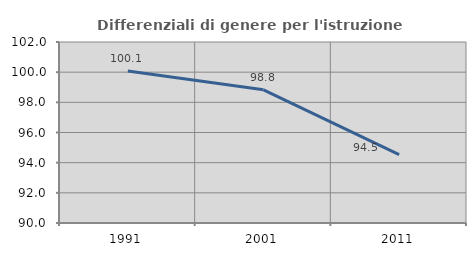
| Category | Differenziali di genere per l'istruzione superiore |
|---|---|
| 1991.0 | 100.078 |
| 2001.0 | 98.829 |
| 2011.0 | 94.532 |